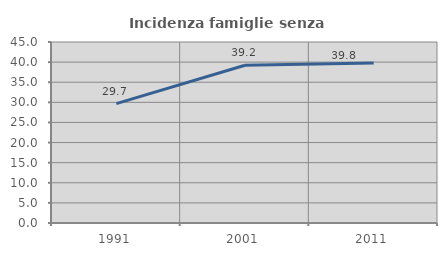
| Category | Incidenza famiglie senza nuclei |
|---|---|
| 1991.0 | 29.67 |
| 2001.0 | 39.21 |
| 2011.0 | 39.793 |